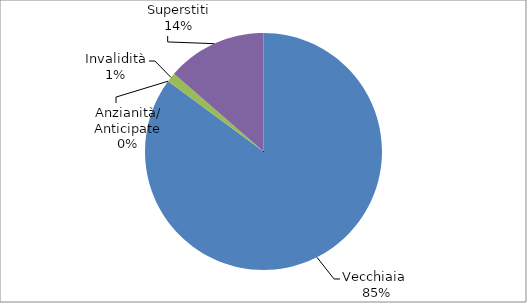
| Category | Series 0 |
|---|---|
| Vecchiaia  | 29984 |
| Anzianità/ Anticipate | 0 |
| Invalidità | 449 |
| Superstiti | 4797 |